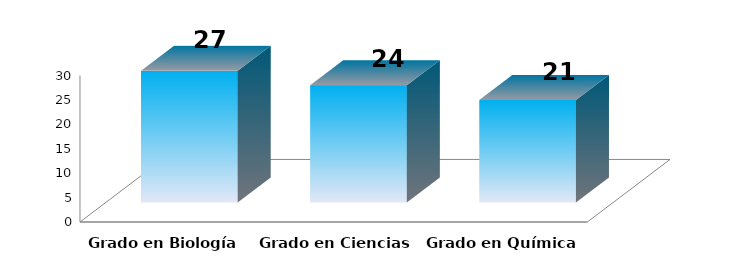
| Category | Series 0 |
|---|---|
| Grado en Biología | 27 |
| Grado en Ciencias Ambientales | 24 |
| Grado en Química | 21 |